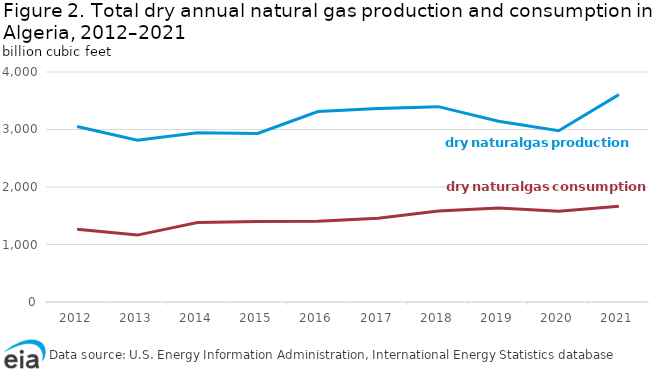
| Category | dry natural gas production | dry natural gas consumption |
|---|---|---|
| 2012.0 | 3053.123 | 1265.831 |
| 2013.0 | 2812.769 | 1163.559 |
| 2014.0 | 2941.563 | 1380.993 |
| 2015.0 | 2932.558 | 1399.216 |
| 2016.0 | 3312.014 | 1404.407 |
| 2017.0 | 3364.616 | 1457.626 |
| 2018.0 | 3397.494 | 1582.371 |
| 2019.0 | 3144.732 | 1633.623 |
| 2020.0 | 2977.701 | 1578.376 |
| 2021.0 | 3606.955 | 1664.065 |